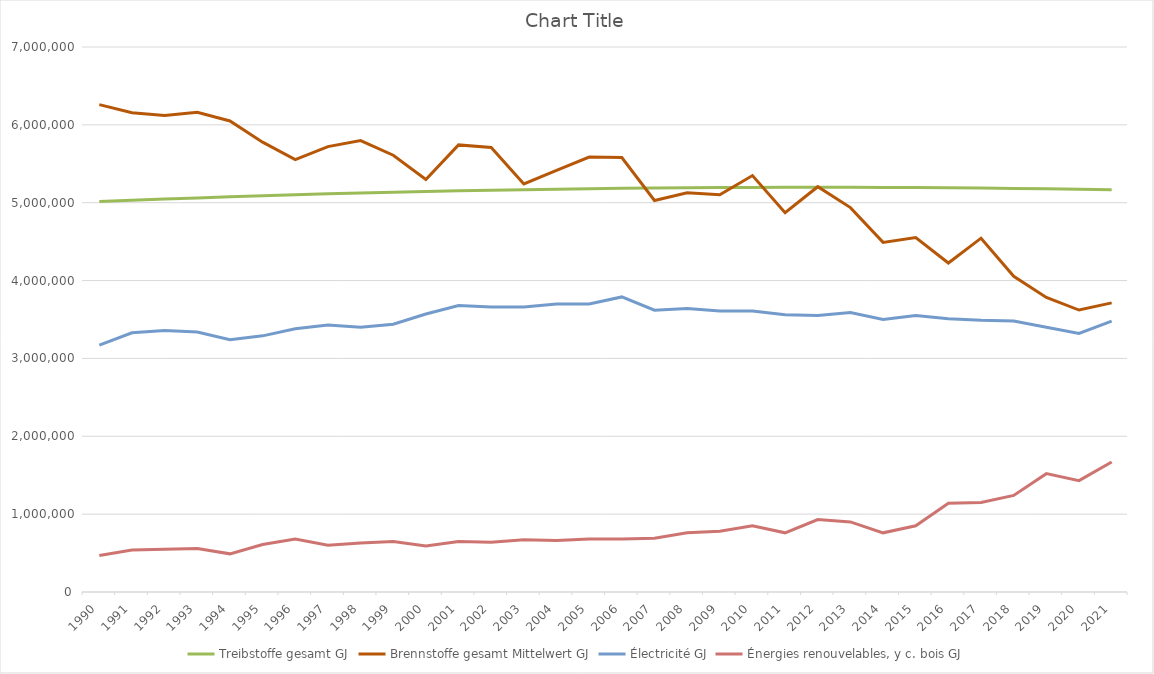
| Category | Treibstoffe gesamt | max. | min. | Brennstoffe gesamt max. | Brennstoffe gesamt min. | Brennstoffe gesamt Mittelwert | Électricité | Énergies renouvelables, y c. bois | Direkte Energie gesamt max. | Direkte Energie gesamt min. |
|---|---|---|---|---|---|---|---|---|---|---|
| 1990.0 | 5015253.014 |  |  |  |  | 6259835.922 | 3170000 | 470000 |  |  |
| 1991.0 | 5031624.895 |  |  |  |  | 6155042.752 | 3330000 | 540000 |  |  |
| 1992.0 | 5047222.469 |  |  |  |  | 6119944.542 | 3360000 | 550000 |  |  |
| 1993.0 | 5062046.513 |  |  |  |  | 6161872.301 | 3340000 | 560000 |  |  |
| 1994.0 | 5076097.805 |  |  |  |  | 6049708.78 | 3240000 | 490000 |  |  |
| 1995.0 | 5089377.118 |  |  |  |  | 5777545.26 | 3290000 | 610000 |  |  |
| 1996.0 | 5101885.227 |  |  |  |  | 5552813.9 | 3380000 | 680000 |  |  |
| 1997.0 | 5113622.904 |  |  |  |  | 5720755.579 | 3430000 | 600000 |  |  |
| 1998.0 | 5124590.92 |  |  |  |  | 5798697.258 | 3400000 | 630000 |  |  |
| 1999.0 | 5134790.046 |  |  |  |  | 5609765.255 | 3440000 | 650000 |  |  |
| 2000.0 | 5144221.05 |  |  |  |  | 5297585.529 | 3570000 | 590000 |  |  |
| 2001.0 | 5152884.702 |  |  |  |  | 5742353.481 | 3680000 | 650000 |  |  |
| 2002.0 | 5160781.766 |  |  |  |  | 5710152.587 | 3660000 | 640000 |  |  |
| 2003.0 | 5167913.01 |  |  |  |  | 5240681.762 | 3660000 | 670000 |  |  |
| 2004.0 | 5174279.197 |  |  |  |  | 5416105.145 | 3700000 | 660000 |  |  |
| 2005.0 | 5179881.091 |  |  |  |  | 5587135.723 | 3700000 | 680000 |  |  |
| 2006.0 | 5184719.455 |  |  |  |  | 5579349.412 | 3790000 | 680000 |  |  |
| 2007.0 | 5188795.048 |  |  |  |  | 5029153.264 | 3620000 | 690000 |  |  |
| 2008.0 | 5192108.631 |  |  |  |  | 5128654.988 | 3640000 | 760000 |  |  |
| 2009.0 | 5194660.964 |  |  |  |  | 5103265.627 | 3610000 | 780000 |  |  |
| 2010.0 | 5196452.802 |  |  |  |  | 5348597.184 | 3610000 | 850000 |  |  |
| 2011.0 | 5197484.904 |  |  |  |  | 4871067.295 | 3560000 | 760000 |  |  |
| 2012.0 | 5197758.024 |  |  |  |  | 5205630.595 | 3550000 | 930000 |  |  |
| 2013.0 | 5197272.917 |  |  |  |  | 4937136.607 | 3590000 | 900000 |  |  |
| 2014.0 | 5196030.336 |  |  |  |  | 4490645.479 | 3500000 | 760000 |  |  |
| 2015.0 | 5194031.033 |  |  |  |  | 4552844.38 | 3550000 | 850000 |  |  |
| 2016.0 | 5191275.758 |  |  |  |  | 4225507.213 | 3510000 | 1140000 |  |  |
| 2017.0 | 5187765.262 |  |  |  |  | 4544478.848 | 3490000 | 1150000 |  |  |
| 2018.0 | 5183500.293 |  |  |  |  | 4055271.885 | 3480000 | 1240000 |  |  |
| 2019.0 | 5178481.598 |  |  |  |  | 3783852.286 | 3400000 | 1520000 |  |  |
| 2020.0 | 5172709.925 |  |  |  |  | 3621384.166 | 3320000 | 1430000 |  |  |
| 2021.0 | 5166186.019 |  |  |  |  | 3713234.098 | 3480000 | 1670000 |  |  |